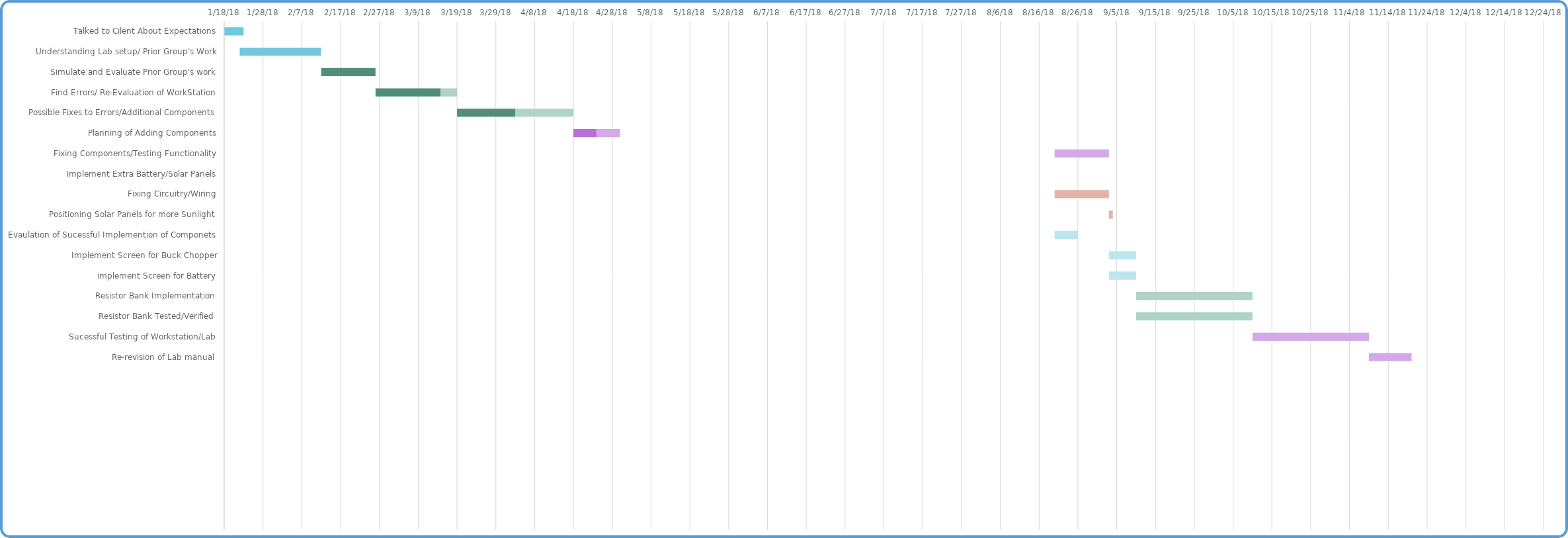
| Category | Start Date | Days Complete | Days Remain |
|---|---|---|---|
| Talked to Cilent About Expectations | 1/18/18 | 5 | 0 |
| Understanding Lab setup/ Prior Group's Work | 1/22/18 | 21 | 0 |
| Simulate and Evaluate Prior Group's work | 2/12/18 | 14 | 0 |
| Find Errors/ Re-Evaluation of WorkStation | 2/26/18 | 16.8 | 4.2 |
| Possible Fixes to Errors/Additional Components | 3/19/18 | 15 | 15 |
| Planning of Adding Components | 4/18/18 | 6 | 6 |
| Fixing Components/Testing Functionality | 8/20/18 | 0 | 14 |
| Implement Extra Battery/Solar Panels | 8/20/18 | 0 | 0 |
| Fixing Circuitry/Wiring | 8/20/18 | 0 | 14 |
| Positioning Solar Panels for more Sunlight | 9/3/18 | 0 | 1 |
| Evaulation of Sucessful Implemention of Componets | 8/20/18 | 0 | 6 |
| Implement Screen for Buck Chopper | 9/3/18 | 0 | 7 |
| implement Screen for Battery | 9/3/18 | 0 | 7 |
| Resistor Bank Implementation | 9/10/18 | 0 | 30 |
| Resistor Bank Tested/Verified | 9/10/18 | 0 | 30 |
| Sucessful Testing of Workstation/Lab | 10/10/18 | 0 | 30 |
| Re-revision of Lab manual | 11/9/18 | 0 | 11 |